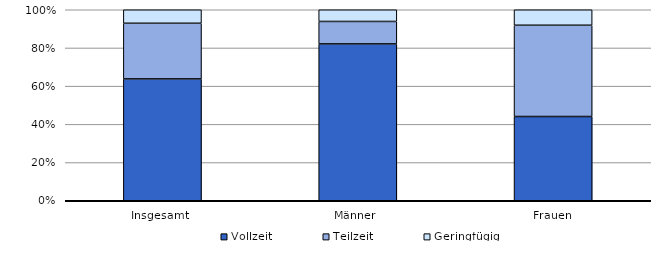
| Category | Vollzeit | Teilzeit | Geringfügig |
|---|---|---|---|
| Insgesamt  | 63.794 | 29.13 | 7.076 |
| Männer  | 82.114 | 11.763 | 6.123 |
| Frauen | 44.11 | 47.791 | 8.1 |